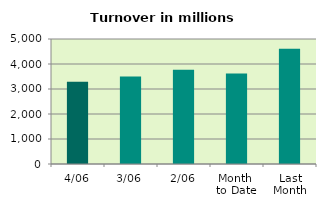
| Category | Series 0 |
|---|---|
| 4/06 | 3287.768 |
| 3/06 | 3504.99 |
| 2/06 | 3765.093 |
| Month 
to Date | 3621.65 |
| Last
Month | 4609.327 |